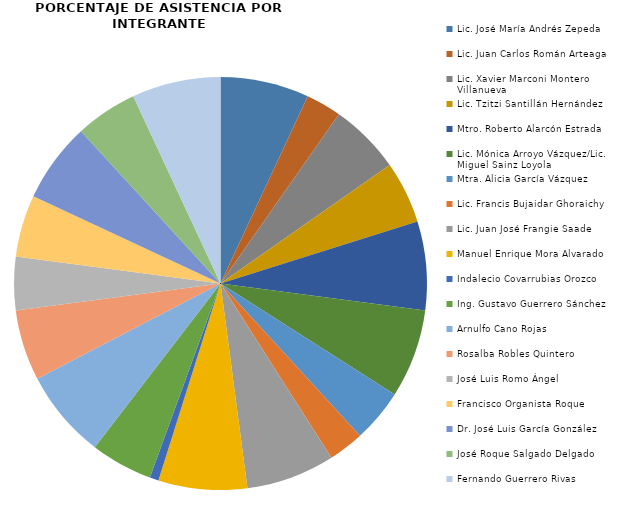
| Category | Series 0 |
|---|---|
| Lic. José María Andrés Zepeda | 10 |
| Lic. Juan Carlos Román Arteaga  | 4 |
| Lic. Xavier Marconi Montero Villanueva | 8 |
| Lic. Tzitzi Santillán Hernández | 7 |
| Mtro. Roberto Alarcón Estrada | 10 |
| Lic. Mónica Arroyo Vázquez/Lic. Miguel Sainz Loyola | 10 |
| Mtra. Alicia García Vázquez | 6 |
| Lic. Francis Bujaidar Ghoraichy | 4 |
| Lic. Juan José Frangie Saade  | 10 |
| Manuel Enrique Mora Alvarado | 10 |
| Indalecio Covarrubias Orozco  | 1 |
| Ing. Gustavo Guerrero Sánchez  | 7 |
| Arnulfo Cano Rojas | 10 |
| Rosalba Robles Quintero | 8 |
| José Luis Romo Ángel  | 6 |
| Francisco Organista Roque | 7 |
| Dr. José Luis García González  | 9 |
| José Roque Salgado Delgado  | 7 |
| Fernando Guerrero Rivas  | 10 |